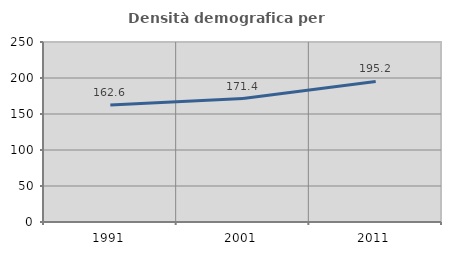
| Category | Densità demografica |
|---|---|
| 1991.0 | 162.552 |
| 2001.0 | 171.427 |
| 2011.0 | 195.171 |